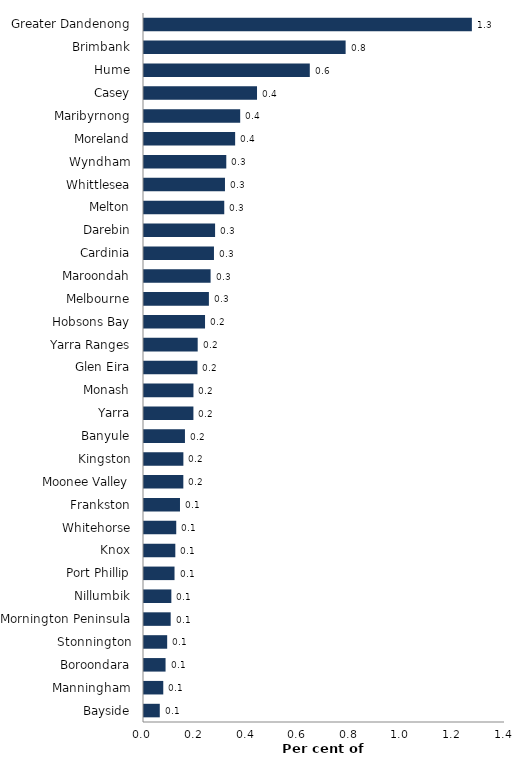
| Category | Series 0 |
|---|---|
| Bayside | 0.061 |
| Manningham | 0.075 |
| Boroondara | 0.084 |
| Stonnington | 0.09 |
| Mornington Peninsula | 0.103 |
| Nillumbik | 0.106 |
| Port Phillip | 0.118 |
| Knox | 0.121 |
| Whitehorse | 0.125 |
| Frankston | 0.14 |
| Moonee Valley | 0.153 |
| Kingston | 0.153 |
| Banyule | 0.159 |
| Yarra | 0.192 |
| Monash | 0.192 |
| Glen Eira | 0.207 |
| Yarra Ranges | 0.208 |
| Hobsons Bay | 0.237 |
| Melbourne | 0.252 |
| Maroondah | 0.258 |
| Cardinia | 0.271 |
| Darebin | 0.276 |
| Melton | 0.311 |
| Whittlesea | 0.314 |
| Wyndham | 0.319 |
| Moreland | 0.353 |
| Maribyrnong | 0.373 |
| Casey | 0.438 |
| Hume | 0.643 |
| Brimbank | 0.782 |
| Greater Dandenong | 1.272 |